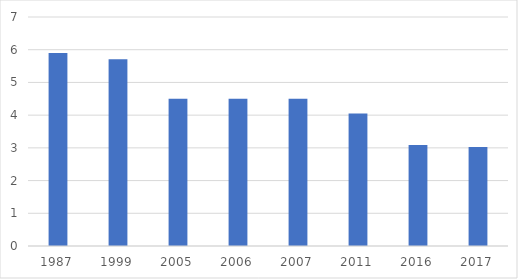
| Category | Marshall Islands |
|---|---|
| 1987.0 | 5.9 |
| 1999.0 | 5.71 |
| 2005.0 | 4.5 |
| 2006.0 | 4.5 |
| 2007.0 | 4.5 |
| 2011.0 | 4.05 |
| 2016.0 | 3.09 |
| 2017.0 | 3.03 |